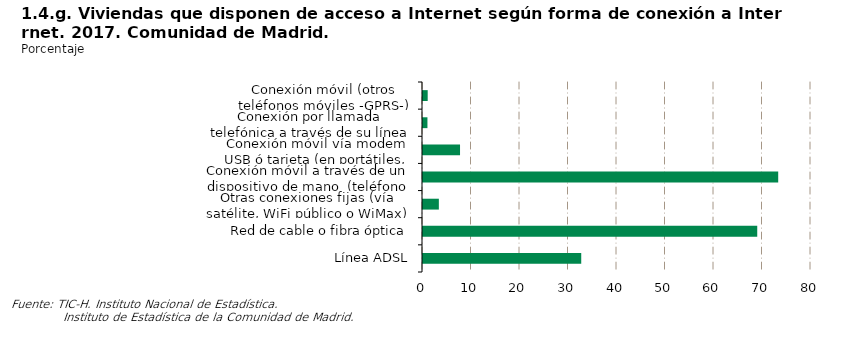
| Category | Series 0 |
|---|---|
| Línea ADSL | 32.626 |
| Red de cable o fibra óptica | 68.915 |
| Otras conexiones fijas (vía satélite, WiFi público o WiMax) | 3.268 |
| Conexión móvil a través de un dispositivo de mano  (teléfono móvil de últimas generaciones -al menos 3G-, iPod,...) | 73.238 |
| Conexión móvil vía modem USB ó tarjeta (en portátiles, p.ej.) | 7.636 |
| Conexión por llamada telefónica a través de su línea de teléfono convencional (módem) o RDSI | 0.915 |
| Conexión móvil (otros teléfonos móviles -GPRS-) | 0.968 |